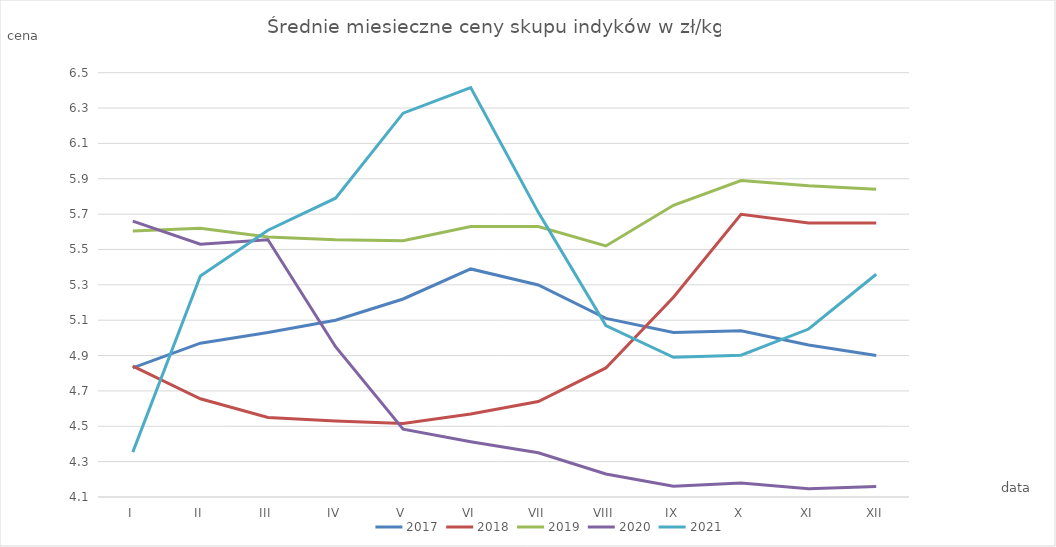
| Category | 2017 | 2018 | 2019 | 2020 | 2021 |
|---|---|---|---|---|---|
| I | 4.83 | 4.84 | 5.604 | 5.66 | 4.354 |
| II | 4.97 | 4.656 | 5.62 | 5.53 | 5.35 |
| III | 5.03 | 4.55 | 5.57 | 5.555 | 5.609 |
| IV | 5.1 | 4.53 | 5.555 | 4.95 | 5.79 |
| V | 5.22 | 4.516 | 5.55 | 4.484 | 6.271 |
| VI | 5.39 | 4.57 | 5.63 | 4.413 | 6.416 |
| VII | 5.299 | 4.64 | 5.63 | 4.35 | 5.71 |
| VIII | 5.11 | 4.83 | 5.52 | 4.23 | 5.07 |
| IX | 5.03 | 5.23 | 5.75 | 4.161 | 4.89 |
| X | 5.04 | 5.699 | 5.89 | 4.179 | 4.902 |
| XI | 4.96 | 5.65 | 5.86 | 4.146 | 5.05 |
| XII | 4.9 | 5.65 | 5.84 | 4.16 | 5.36 |